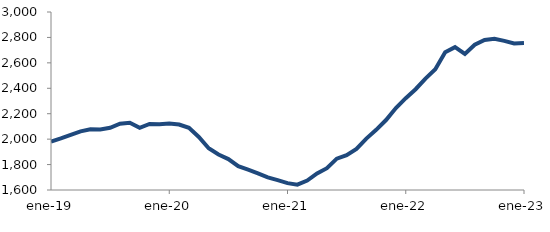
| Category | Series 0 |
|---|---|
| 2019-01-01 | 1980.122 |
| 2019-02-01 | 2005.664 |
| 2019-03-01 | 2033.637 |
| 2019-04-01 | 2060.76 |
| 2019-05-01 | 2078.07 |
| 2019-06-01 | 2076.377 |
| 2019-07-01 | 2089.152 |
| 2019-08-01 | 2121.901 |
| 2019-09-01 | 2128.491 |
| 2019-10-01 | 2088.553 |
| 2019-11-01 | 2119.211 |
| 2019-12-01 | 2116.27 |
| 2020-01-01 | 2123.179 |
| 2020-02-01 | 2115.217 |
| 2020-03-01 | 2088.6 |
| 2020-04-01 | 2017.241 |
| 2020-05-01 | 1928.116 |
| 2020-06-01 | 1878.979 |
| 2020-07-01 | 1843.29 |
| 2020-08-01 | 1787.543 |
| 2020-09-01 | 1760.281 |
| 2020-10-01 | 1731.197 |
| 2020-11-01 | 1698.835 |
| 2020-12-01 | 1677.184 |
| 2021-01-01 | 1654.072 |
| 2021-02-01 | 1641.869 |
| 2021-03-01 | 1673.821 |
| 2021-04-01 | 1730.759 |
| 2021-05-01 | 1771.425 |
| 2021-06-01 | 1846.573 |
| 2021-07-01 | 1874.111 |
| 2021-08-01 | 1922.894 |
| 2021-09-01 | 2004.225 |
| 2021-10-01 | 2073.331 |
| 2021-11-01 | 2150.314 |
| 2021-12-01 | 2244.492 |
| 2022-01-01 | 2321.95 |
| 2022-02-01 | 2392.65 |
| 2022-03-01 | 2476.383 |
| 2022-04-01 | 2549.069 |
| 2022-05-01 | 2683.336 |
| 2022-06-01 | 2723.868 |
| 2022-07-01 | 2670.585 |
| 2022-08-01 | 2742.913 |
| 2022-09-01 | 2780.46 |
| 2022-10-01 | 2788.916 |
| 2022-11-01 | 2772.628 |
| 2022-12-01 | 2752.307 |
| 2023-01-01 | 2755.69 |